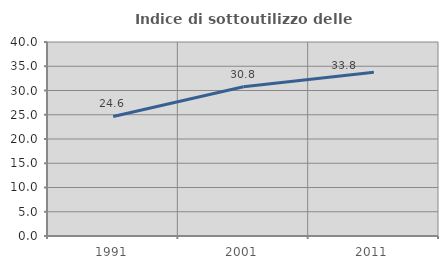
| Category | Indice di sottoutilizzo delle abitazioni  |
|---|---|
| 1991.0 | 24.645 |
| 2001.0 | 30.771 |
| 2011.0 | 33.768 |